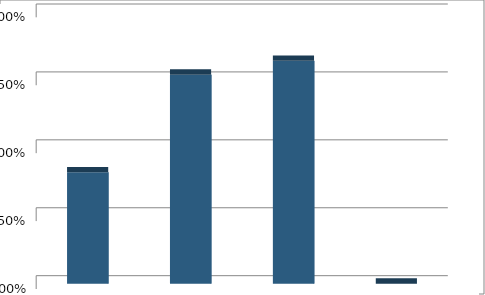
| Category | Series1 |
|---|---|
| Alternative Future #1: Low Intensity | 0.205 |
| Alternative Future #2: Medium Intensity | 0.385 |
| Alternative Future #3: High Intensity | 0.41 |
| None of the Above | 0 |